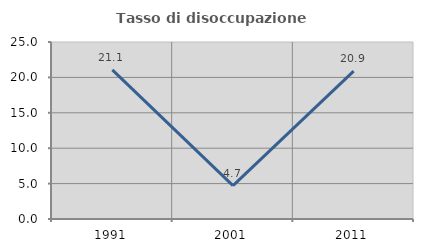
| Category | Tasso di disoccupazione giovanile  |
|---|---|
| 1991.0 | 21.053 |
| 2001.0 | 4.706 |
| 2011.0 | 20.896 |